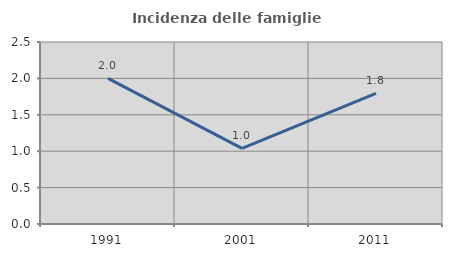
| Category | Incidenza delle famiglie numerose |
|---|---|
| 1991.0 | 2 |
| 2001.0 | 1.039 |
| 2011.0 | 1.794 |